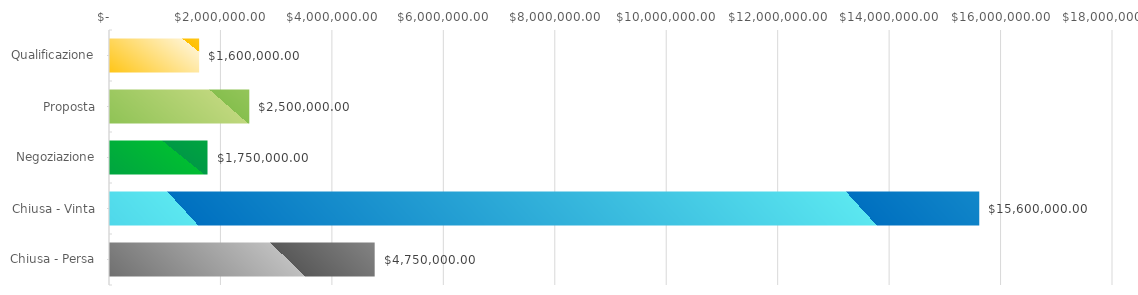
| Category | Series 0 |
|---|---|
| Qualificazione | 1600000 |
| Proposta | 2500000 |
| Negoziazione | 1750000 |
| Chiusa - Vinta | 15600000 |
| Chiusa - Persa | 4750000 |